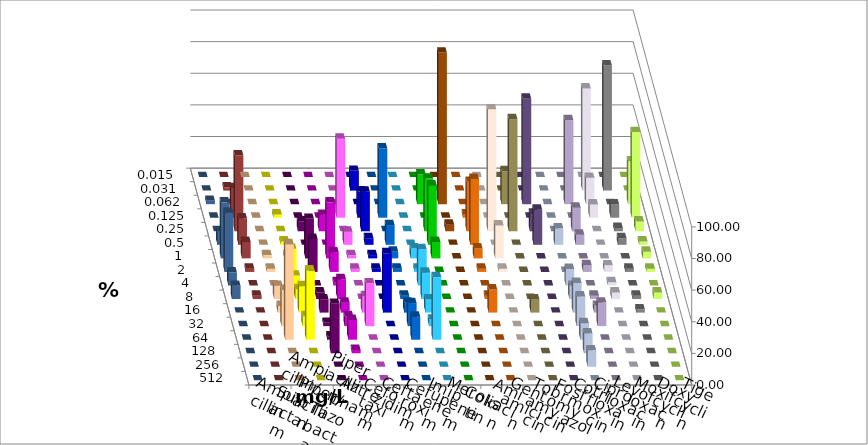
| Category | Ampicillin | Ampicillin/ Sulbactam | Piperacillin | Piperacillin/ Tazobactam | Aztreonam | Cefotaxim | Ceftazidim | Cefuroxim | Imipenem | Meropenem | Colistin | Amikacin | Gentamicin | Tobramycin | Fosfomycin | Cotrimoxazol | Ciprofloxacin | Levofloxacin | Moxifloxacin | Doxycyclin | Tigecyclin |
|---|---|---|---|---|---|---|---|---|---|---|---|---|---|---|---|---|---|---|---|---|---|
| 0.015 | 0 | 0 | 0 | 0 | 0 | 0 | 0 | 0 | 0 | 0 | 0 | 0 | 0 | 0 | 0 | 0 | 0 | 0 | 0 | 0 | 0 |
| 0.031 | 0 | 0 | 0 | 0 | 0 | 12.5 | 0 | 0 | 0 | 0 | 0 | 0 | 0 | 0 | 0 | 0 | 64.583 | 79.167 | 0 | 0 | 2.083 |
| 0.062 | 0 | 0 | 0 | 0 | 0 | 0 | 0 | 0 | 18.75 | 95.833 | 0 | 0 | 20.833 | 66.667 | 0 | 53.191 | 16.667 | 0 | 27.083 | 2.083 | 0 |
| 0.125 | 0 | 2.083 | 0 | 0 | 50 | 16.667 | 43.75 | 0 | 0 | 0 | 2.083 | 0 | 0 | 0 | 0 | 0 | 8.333 | 8.333 | 54.167 | 0 | 18.75 |
| 0.25 | 0 | 0 | 6.25 | 10.417 | 0 | 25 | 0 | 0 | 33.333 | 4.167 | 31.25 | 77.083 | 70.833 | 11.111 | 0 | 14.894 | 0 | 2.083 | 6.25 | 0 | 47.917 |
| 0.5 | 0 | 2.083 | 0 | 0 | 8.333 | 4.167 | 12.5 | 0 | 37.5 | 0 | 41.667 | 0 | 0 | 22.222 | 10.417 | 6.383 | 0 | 4.167 | 2.083 | 8.333 | 16.667 |
| 1.0 | 2.083 | 2.083 | 25 | 35.417 | 2.083 | 2.083 | 4.167 | 6.25 | 10.417 | 0 | 6.25 | 20.833 | 0 | 0 | 0 | 0 | 0 | 0 | 4.167 | 35.417 | 10.417 |
| 2.0 | 2.083 | 14.583 | 20.833 | 12.5 | 2.083 | 2.083 | 2.083 | 2.083 | 0 | 0 | 2.083 | 2.083 | 0 | 0 | 0 | 4.255 | 4.167 | 2.083 | 2.083 | 37.5 | 2.083 |
| 4.0 | 0 | 6.25 | 0 | 2.083 | 0 | 0 | 0 | 22.917 | 0 | 0 | 0 | 0 | 0 | 0 | 10.417 | 0 | 2.083 | 0 | 0 | 8.333 | 0 |
| 8.0 | 8.333 | 6.25 | 4.167 | 12.5 | 0 | 0 | 2.083 | 16.667 | 0 | 0 | 2.083 | 0 | 0 | 0 | 8.333 | 2.128 | 4.167 | 2.083 | 4.167 | 8.333 | 2.083 |
| 16.0 | 4.167 | 16.667 | 8.333 | 6.25 | 10.417 | 37.5 | 6.25 | 8.333 | 0 | 0 | 14.583 | 0 | 8.333 | 0 | 18.75 | 4.255 | 0 | 2.083 | 0 | 0 | 0 |
| 32.0 | 22.917 | 6.25 | 2.083 | 6.25 | 27.083 | 0 | 14.583 | 4.167 | 0 | 0 | 0 | 0 | 0 | 0 | 18.75 | 14.894 | 0 | 0 | 0 | 0 | 0 |
| 64.0 | 60.417 | 43.75 | 2.083 | 12.5 | 0 | 0 | 14.583 | 39.583 | 0 | 0 | 0 | 0 | 0 | 0 | 10.417 | 0 | 0 | 0 | 0 | 0 | 0 |
| 128.0 | 0 | 0 | 31.25 | 2.083 | 0 | 0 | 0 | 0 | 0 | 0 | 0 | 0 | 0 | 0 | 12.5 | 0 | 0 | 0 | 0 | 0 | 0 |
| 256.0 | 0 | 0 | 0 | 0 | 0 | 0 | 0 | 0 | 0 | 0 | 0 | 0 | 0 | 0 | 10.417 | 0 | 0 | 0 | 0 | 0 | 0 |
| 512.0 | 0 | 0 | 0 | 0 | 0 | 0 | 0 | 0 | 0 | 0 | 0 | 0 | 0 | 0 | 0 | 0 | 0 | 0 | 0 | 0 | 0 |